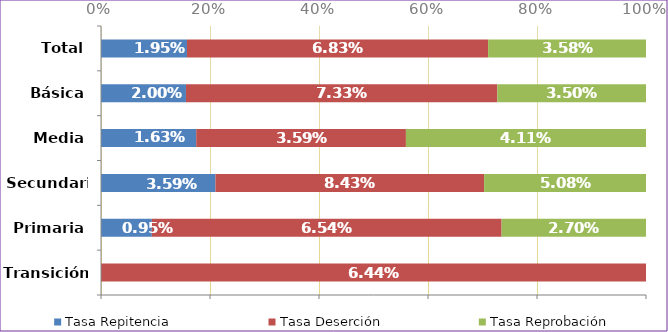
| Category | Tasa Repitencia | Tasa Deserción | Tasa Reprobación |
|---|---|---|---|
| Transición | 0 | 0.064 | 0 |
| Primaria | 0.01 | 0.065 | 0.027 |
| Secundaria | 0.036 | 0.084 | 0.051 |
| Media | 0.016 | 0.036 | 0.041 |
| Básica | 0.02 | 0.073 | 0.035 |
| Total | 0.02 | 0.068 | 0.036 |